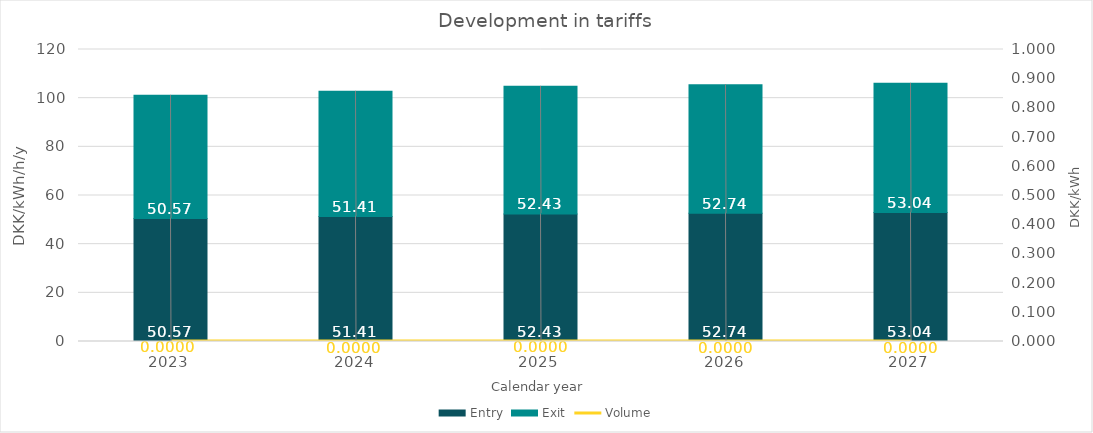
| Category | Entry | Exit |
|---|---|---|
| 2023.0 | 50.574 | 50.574 |
| 2024.0 | 51.408 | 51.408 |
| 2025.0 | 52.426 | 52.426 |
| 2026.0 | 52.745 | 52.745 |
| 2027.0 | 53.044 | 53.044 |